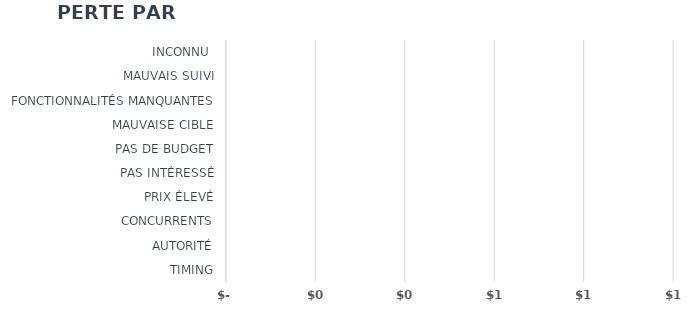
| Category | Series 1 |
|---|---|
| TIMING | 0 |
| AUTORITÉ | 0 |
| CONCURRENTS | 0 |
| PRIX ÉLEVÉ | 0 |
| PAS INTÉRESSÉ | 0 |
| PAS DE BUDGET | 0 |
| MAUVAISE CIBLE | 0 |
| FONCTIONNALITÉS MANQUANTES | 0 |
| MAUVAIS SUIVI | 0 |
| INCONNU  | 0 |